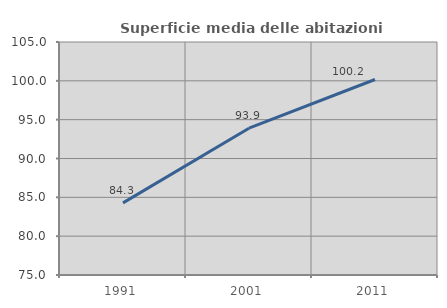
| Category | Superficie media delle abitazioni occupate |
|---|---|
| 1991.0 | 84.281 |
| 2001.0 | 93.898 |
| 2011.0 | 100.17 |